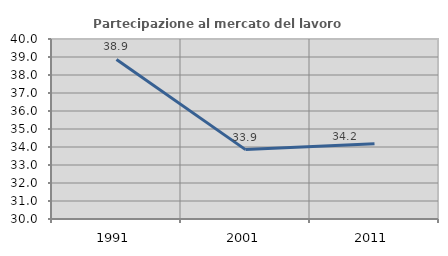
| Category | Partecipazione al mercato del lavoro  femminile |
|---|---|
| 1991.0 | 38.865 |
| 2001.0 | 33.855 |
| 2011.0 | 34.183 |